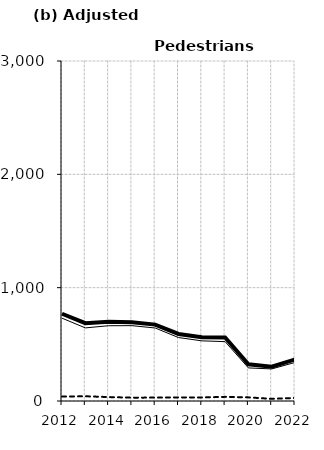
| Category | Built-up | Non built-up | Total |
|---|---|---|---|
| 2012.0 | 730.9 | 38.9 | 769.8 |
| 2013.0 | 645 | 41.9 | 686.9 |
| 2014.0 | 664.2 | 34.6 | 698.8 |
| 2015.0 | 664.8 | 29.5 | 694.3 |
| 2016.0 | 644 | 30 | 674 |
| 2017.0 | 559.8 | 31.9 | 591.7 |
| 2018.0 | 530.7 | 31.3 | 562 |
| 2019.0 | 523.8 | 36.5 | 560.3 |
| 2020.0 | 292 | 32 | 324 |
| 2021.0 | 283 | 19 | 302 |
| 2022.0 | 340 | 27 | 367 |